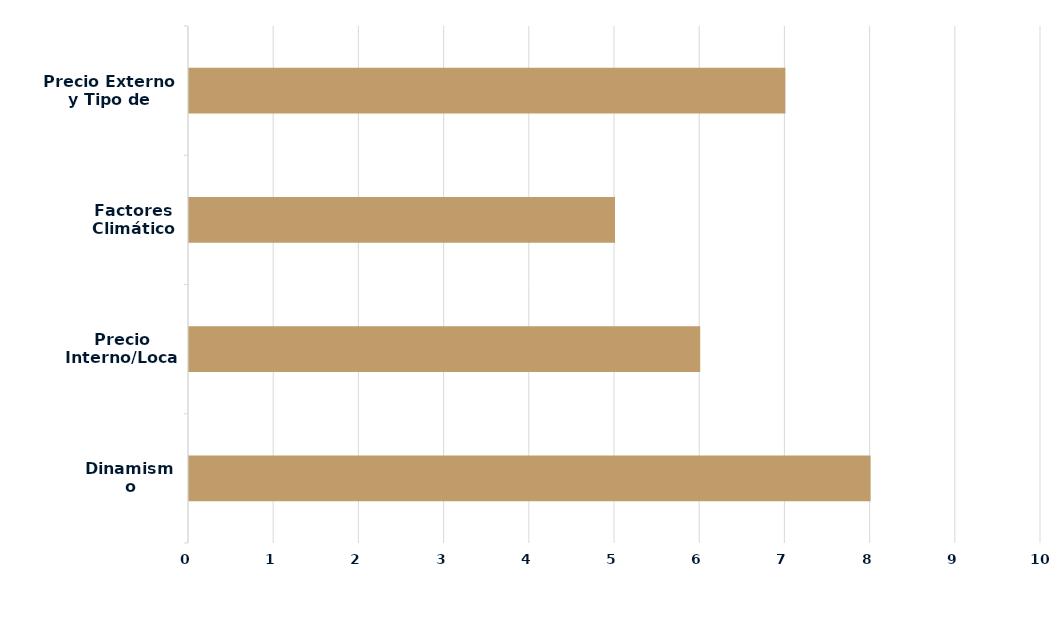
| Category | Series 0 |
|---|---|
| Dinamismo Demanda | 8 |
| Precio Interno/Local | 6 |
| Factores Climáticos | 5 |
| Precio Externo y Tipo de Cambio | 7 |